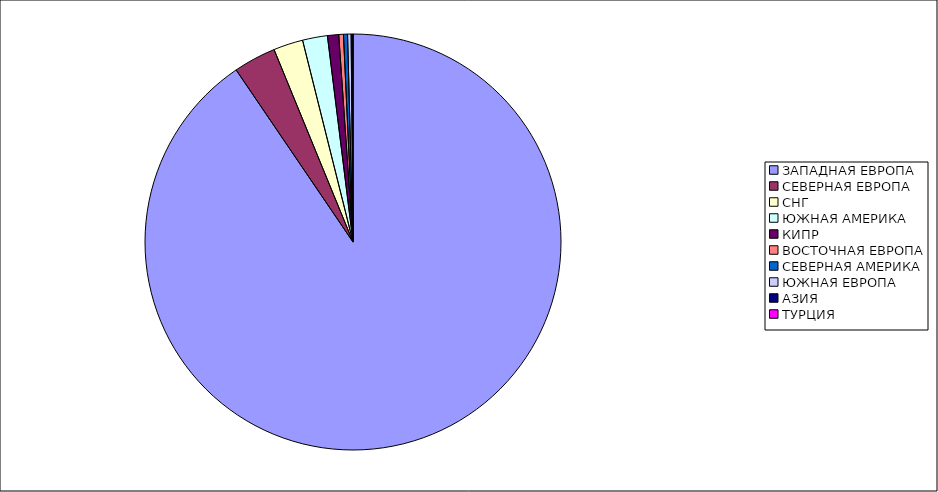
| Category | Оборот |
|---|---|
| ЗАПАДНАЯ ЕВРОПА | 0.905 |
| СЕВЕРНАЯ ЕВРОПА | 0.033 |
| СНГ | 0.023 |
| ЮЖНАЯ АМЕРИКА | 0.019 |
| КИПР | 0.009 |
| ВОСТОЧНАЯ ЕВРОПА | 0.004 |
| СЕВЕРНАЯ АМЕРИКА | 0.003 |
| ЮЖНАЯ ЕВРОПА | 0.003 |
| АЗИЯ | 0.001 |
| ТУРЦИЯ | 0 |